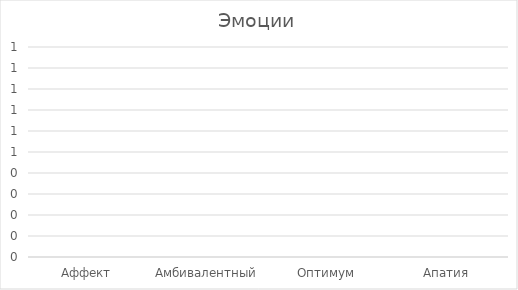
| Category | Series 0 |
|---|---|
| Аффект | 0 |
| Амбивалентный | 0 |
| Оптимум | 0 |
| Апатия | 0 |